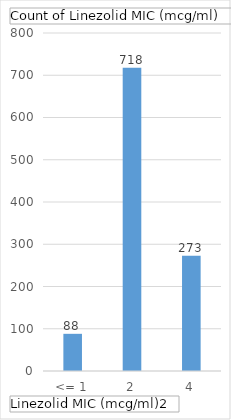
| Category | Total |
|---|---|
| <= 1 | 88 |
| 2 | 718 |
| 4 | 273 |